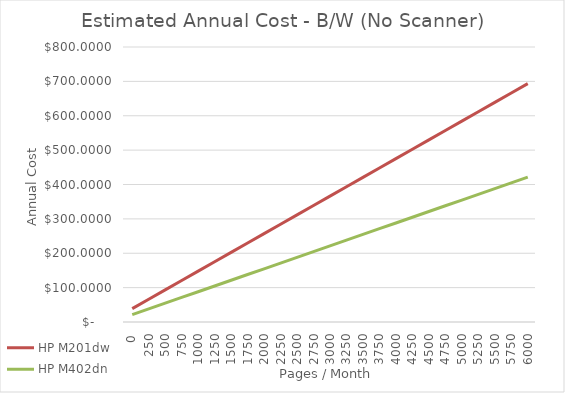
| Category | HP M201dw | HP M402dn |
|---|---|---|
| 0.0 | 39 | 21.429 |
| 250.0 | 66.273 | 38.095 |
| 500.0 | 93.545 | 54.762 |
| 750.0 | 120.818 | 71.429 |
| 1000.0 | 148.091 | 88.095 |
| 1250.0 | 175.364 | 104.762 |
| 1500.0 | 202.636 | 121.429 |
| 1750.0 | 229.909 | 138.095 |
| 2000.0 | 257.182 | 154.762 |
| 2250.0 | 284.455 | 171.429 |
| 2500.0 | 311.727 | 188.095 |
| 2750.0 | 339 | 204.762 |
| 3000.0 | 366.273 | 221.429 |
| 3250.0 | 393.545 | 238.095 |
| 3500.0 | 420.818 | 254.762 |
| 3750.0 | 448.091 | 271.429 |
| 4000.0 | 475.364 | 288.095 |
| 4250.0 | 502.636 | 304.762 |
| 4500.0 | 529.909 | 321.429 |
| 4750.0 | 557.182 | 338.095 |
| 5000.0 | 584.455 | 354.762 |
| 5250.0 | 611.727 | 371.429 |
| 5500.0 | 639 | 388.095 |
| 5750.0 | 666.273 | 404.762 |
| 6000.0 | 693.545 | 421.429 |